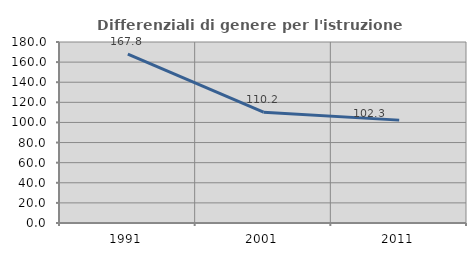
| Category | Differenziali di genere per l'istruzione superiore |
|---|---|
| 1991.0 | 167.832 |
| 2001.0 | 110.188 |
| 2011.0 | 102.308 |